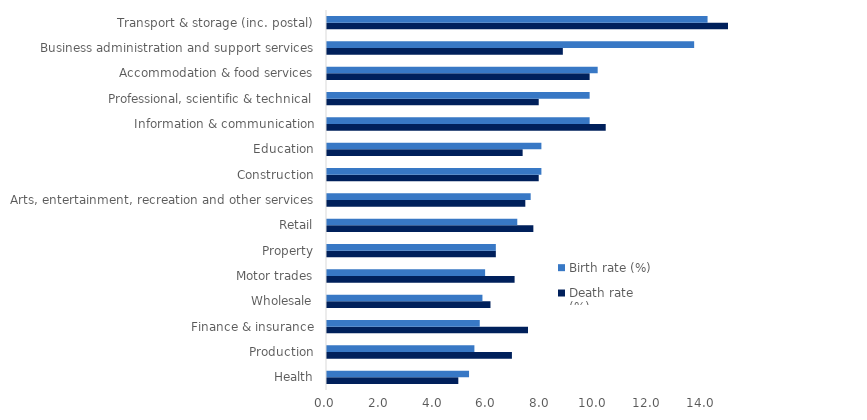
| Category | Death rate (%) | Birth rate (%) |
|---|---|---|
| Health | 4.9 | 5.3 |
| Production | 6.9 | 5.5 |
| Finance & insurance | 7.5 | 5.7 |
| Wholesale | 6.1 | 5.8 |
| Motor trades | 7 | 5.9 |
| Property | 6.3 | 6.3 |
| Retail | 7.7 | 7.1 |
| Arts, entertainment, recreation and other services | 7.4 | 7.6 |
| Construction | 7.9 | 8 |
| Education | 7.3 | 8 |
| Information & communication | 10.4 | 9.8 |
| Professional, scientific & technical | 7.9 | 9.8 |
| Accommodation & food services | 9.8 | 10.1 |
| Business administration and support services | 8.8 | 13.7 |
| Transport & storage (inc. postal) | 16.2 | 14.2 |